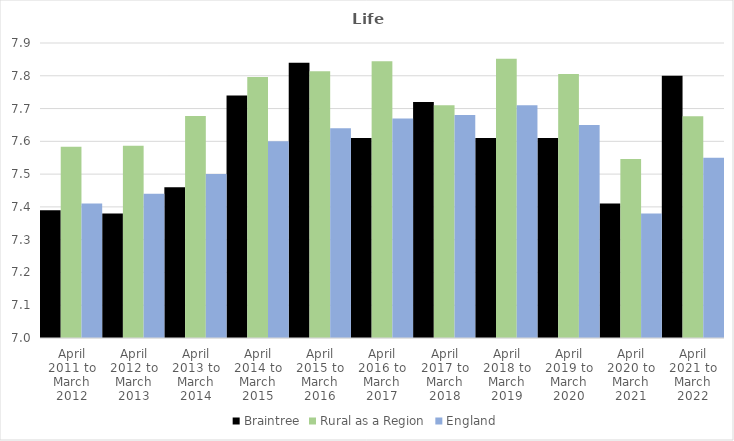
| Category | Braintree | Rural as a Region | England |
|---|---|---|---|
| April 2011 to March 2012 | 7.39 | 7.584 | 7.41 |
| April 2012 to March 2013 | 7.38 | 7.586 | 7.44 |
| April 2013 to March 2014 | 7.46 | 7.677 | 7.5 |
| April 2014 to March 2015 | 7.74 | 7.797 | 7.6 |
| April 2015 to March 2016 | 7.84 | 7.813 | 7.64 |
| April 2016 to March 2017 | 7.61 | 7.845 | 7.67 |
| April 2017 to March 2018 | 7.72 | 7.71 | 7.68 |
| April 2018 to March 2019 | 7.61 | 7.852 | 7.71 |
| April 2019 to March 2020 | 7.61 | 7.806 | 7.65 |
| April 2020 to March 2021 | 7.41 | 7.546 | 7.38 |
| April 2021 to March 2022 | 7.8 | 7.677 | 7.55 |